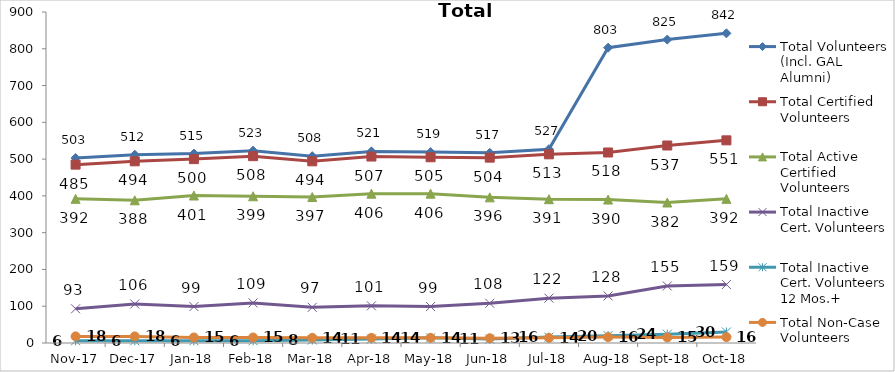
| Category | Total Volunteers (Incl. GAL Alumni) | Total Certified Volunteers | Total Active Certified Volunteers | Total Inactive Cert. Volunteers | Total Inactive Cert. Volunteers 12 Mos.+ | Total Non-Case Volunteers |
|---|---|---|---|---|---|---|
| 2017-11-01 | 503 | 485 | 392 | 93 | 6 | 18 |
| 2017-12-01 | 512 | 494 | 388 | 106 | 6 | 18 |
| 2018-01-01 | 515 | 500 | 401 | 99 | 6 | 15 |
| 2018-02-01 | 523 | 508 | 399 | 109 | 6 | 15 |
| 2018-03-01 | 508 | 494 | 397 | 97 | 8 | 14 |
| 2018-04-01 | 521 | 507 | 406 | 101 | 11 | 14 |
| 2018-05-01 | 519 | 505 | 406 | 99 | 14 | 14 |
| 2018-06-01 | 517 | 504 | 396 | 108 | 11 | 13 |
| 2018-07-01 | 527 | 513 | 391 | 122 | 16 | 14 |
| 2018-08-01 | 803 | 518 | 390 | 128 | 20 | 16 |
| 2018-09-01 | 825 | 537 | 382 | 155 | 24 | 15 |
| 2018-10-01 | 842 | 551 | 392 | 159 | 30 | 16 |